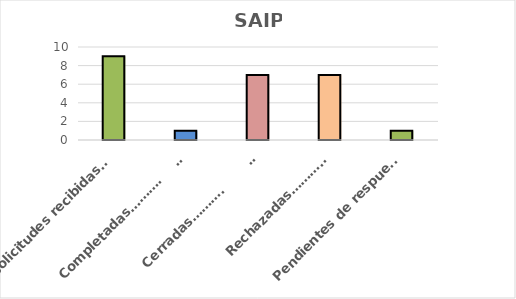
| Category | Series 2 |
|---|---|
| Solicitudes recibidas……….       | 9 |
| Completadas……….          | 1 |
| Cerradas……….            | 7 |
| Rechazadas……….    | 7 |
| Pendientes de respuesta……….        | 1 |